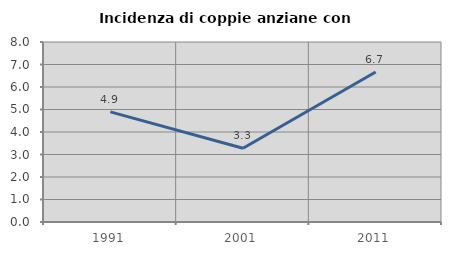
| Category | Incidenza di coppie anziane con figli |
|---|---|
| 1991.0 | 4.895 |
| 2001.0 | 3.279 |
| 2011.0 | 6.667 |